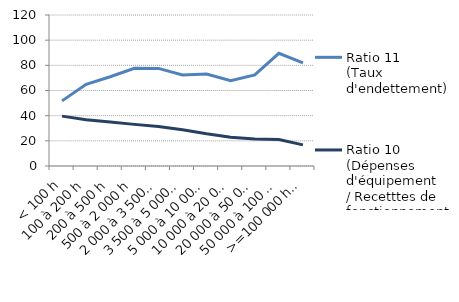
| Category | Ratio 11
(Taux d'endettement) | Ratio 10 
(Dépenses d'équipement
/ Recetttes de fonctionnement) |
|---|---|---|
| < 100 h | 51.764 | 39.637 |
| 100 à 200 h | 64.909 | 36.71 |
| 200 à 500 h | 70.945 | 34.944 |
| 500 à 2 000 h | 77.59 | 33.076 |
| 2 000 à 3 500 h | 77.566 | 31.397 |
| 3 500 à 5 000 h | 72.399 | 28.731 |
| 5 000 à 10 000 h | 73.036 | 25.59 |
| 10 000 à 20 000 h | 67.73 | 22.934 |
| 20 000 à 50 000 h | 72.434 | 21.424 |
| 50 000 à 100 000 h | 89.576 | 21.009 |
| >=100 000 h hors Paris | 81.907 | 16.788 |